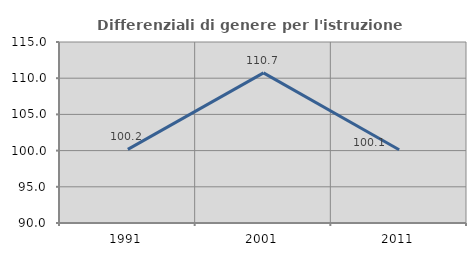
| Category | Differenziali di genere per l'istruzione superiore |
|---|---|
| 1991.0 | 100.162 |
| 2001.0 | 110.73 |
| 2011.0 | 100.118 |